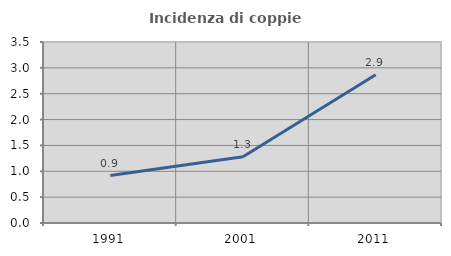
| Category | Incidenza di coppie miste |
|---|---|
| 1991.0 | 0.917 |
| 2001.0 | 1.279 |
| 2011.0 | 2.865 |